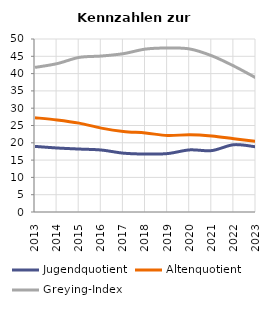
| Category | Jugendquotient | Altenquotient | Greying-Index |
|---|---|---|---|
| 2013.0 | 18.96 | 27.244 | 41.789 |
| 2014.0 | 18.499 | 26.619 | 42.879 |
| 2015.0 | 18.194 | 25.691 | 44.681 |
| 2016.0 | 17.911 | 24.248 | 45.077 |
| 2017.0 | 17.005 | 23.276 | 45.763 |
| 2018.0 | 16.749 | 22.833 | 47.087 |
| 2019.0 | 16.885 | 22.097 | 47.402 |
| 2020.0 | 17.95 | 22.35 | 47.12 |
| 2021.0 | 17.751 | 21.976 | 45.146 |
| 2022.0 | 19.45 | 21.2 | 42.18 |
| 2023.0 | 18.828 | 20.416 | 38.761 |